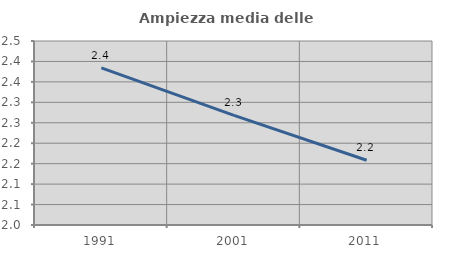
| Category | Ampiezza media delle famiglie |
|---|---|
| 1991.0 | 2.384 |
| 2001.0 | 2.268 |
| 2011.0 | 2.158 |